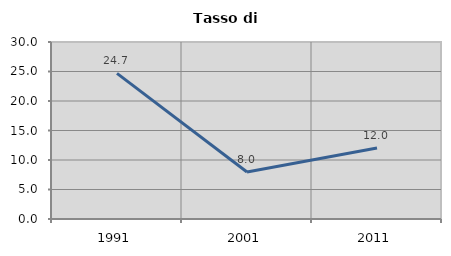
| Category | Tasso di disoccupazione   |
|---|---|
| 1991.0 | 24.688 |
| 2001.0 | 7.958 |
| 2011.0 | 12.04 |